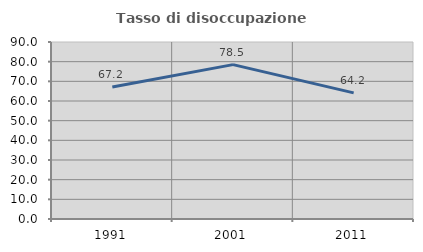
| Category | Tasso di disoccupazione giovanile  |
|---|---|
| 1991.0 | 67.153 |
| 2001.0 | 78.495 |
| 2011.0 | 64.151 |